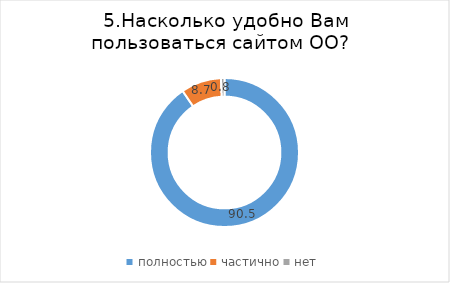
| Category | Series 0 |
|---|---|
| полностью | 90.499 |
| частично | 8.733 |
| нет | 0.768 |